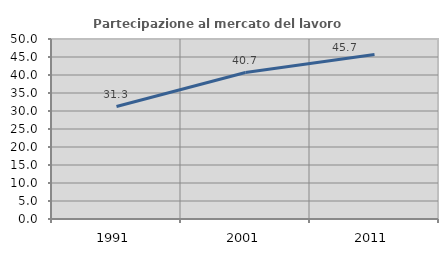
| Category | Partecipazione al mercato del lavoro  femminile |
|---|---|
| 1991.0 | 31.25 |
| 2001.0 | 40.678 |
| 2011.0 | 45.7 |